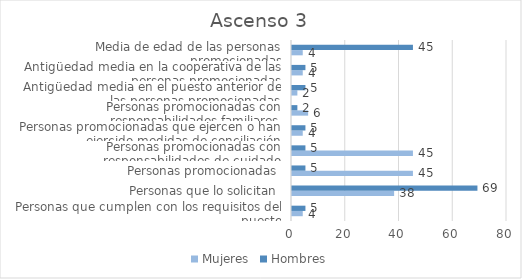
| Category | Mujeres | Hombres |
|---|---|---|
| Personas que cumplen con los requisitos del puesto | 4 | 5 |
| Personas que lo solicitan | 38 | 69 |
| Personas promocionadas | 45 | 5 |
| Personas promocionadas con responsabilidades de cuidado | 45 | 5 |
| Personas promocionadas que ejercen o han ejercido medidas de conciliación | 4 | 5 |
| Personas promocionadas con responsabilidades familiares | 6 | 2 |
| Antigüedad media en el puesto anterior de las personas promocionadas | 2 | 5 |
| Antigüedad media en la cooperativa de las personas promocionadas | 4 | 5 |
| Media de edad de las personas promocionadas | 4 | 45 |